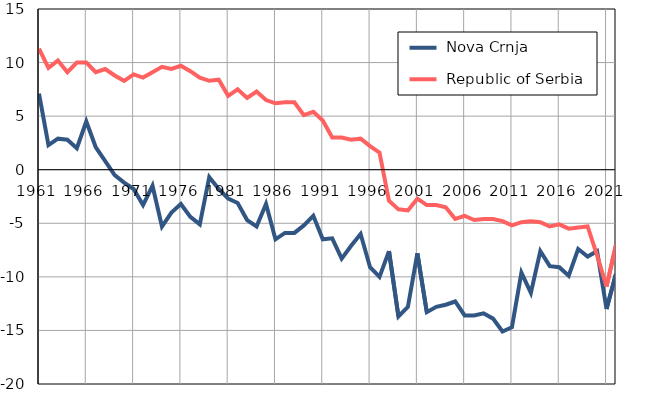
| Category |  Nova Crnja |  Republic of Serbia |
|---|---|---|
| 1961.0 | 7.1 | 11.3 |
| 1962.0 | 2.3 | 9.5 |
| 1963.0 | 2.9 | 10.2 |
| 1964.0 | 2.8 | 9.1 |
| 1965.0 | 2 | 10 |
| 1966.0 | 4.5 | 10 |
| 1967.0 | 2.1 | 9.1 |
| 1968.0 | 0.8 | 9.4 |
| 1969.0 | -0.5 | 8.8 |
| 1970.0 | -1.2 | 8.3 |
| 1971.0 | -1.8 | 8.9 |
| 1972.0 | -3.3 | 8.6 |
| 1973.0 | -1.5 | 9.1 |
| 1974.0 | -5.3 | 9.6 |
| 1975.0 | -4 | 9.4 |
| 1976.0 | -3.2 | 9.7 |
| 1977.0 | -4.4 | 9.2 |
| 1978.0 | -5.1 | 8.6 |
| 1979.0 | -0.7 | 8.3 |
| 1980.0 | -1.8 | 8.4 |
| 1981.0 | -2.7 | 6.9 |
| 1982.0 | -3.1 | 7.5 |
| 1983.0 | -4.7 | 6.7 |
| 1984.0 | -5.3 | 7.3 |
| 1985.0 | -3.2 | 6.5 |
| 1986.0 | -6.5 | 6.2 |
| 1987.0 | -5.9 | 6.3 |
| 1988.0 | -5.9 | 6.3 |
| 1989.0 | -5.2 | 5.1 |
| 1990.0 | -4.3 | 5.4 |
| 1991.0 | -6.5 | 4.6 |
| 1992.0 | -6.4 | 3 |
| 1993.0 | -8.3 | 3 |
| 1994.0 | -7.1 | 2.8 |
| 1995.0 | -6 | 2.9 |
| 1996.0 | -9.1 | 2.2 |
| 1997.0 | -10 | 1.6 |
| 1998.0 | -7.6 | -2.9 |
| 1999.0 | -13.7 | -3.7 |
| 2000.0 | -12.8 | -3.8 |
| 2001.0 | -7.8 | -2.7 |
| 2002.0 | -13.3 | -3.3 |
| 2003.0 | -12.8 | -3.3 |
| 2004.0 | -12.6 | -3.5 |
| 2005.0 | -12.3 | -4.6 |
| 2006.0 | -13.6 | -4.3 |
| 2007.0 | -13.6 | -4.7 |
| 2008.0 | -13.4 | -4.6 |
| 2009.0 | -13.9 | -4.6 |
| 2010.0 | -15.1 | -4.8 |
| 2011.0 | -14.7 | -5.2 |
| 2012.0 | -9.6 | -4.9 |
| 2013.0 | -11.5 | -4.8 |
| 2014.0 | -7.6 | -4.9 |
| 2015.0 | -9 | -5.3 |
| 2016.0 | -9.1 | -5.1 |
| 2017.0 | -9.9 | -5.5 |
| 2018.0 | -7.4 | -5.4 |
| 2019.0 | -8.1 | -5.3 |
| 2020.0 | -7.6 | -8 |
| 2021.0 | -13 | -10.9 |
| 2022.0 | -9.7 | -7 |